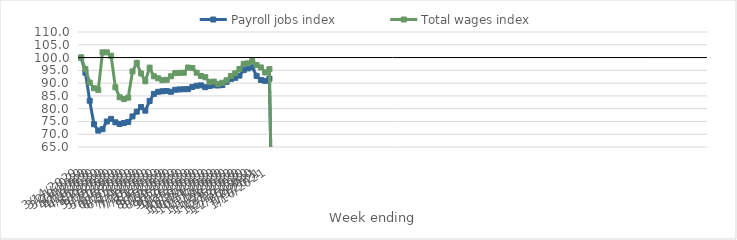
| Category | Payroll jobs index | Total wages index |
|---|---|---|
| 14/03/2020 | 100 | 100 |
| 21/03/2020 | 94.076 | 95.496 |
| 28/03/2020 | 83.088 | 90.226 |
| 04/04/2020 | 73.89 | 87.992 |
| 11/04/2020 | 71.422 | 87.344 |
| 18/04/2020 | 71.98 | 102.041 |
| 25/04/2020 | 74.982 | 102.035 |
| 02/05/2020 | 76.008 | 100.692 |
| 09/05/2020 | 74.663 | 88.355 |
| 16/05/2020 | 74.022 | 84.458 |
| 23/05/2020 | 74.402 | 83.751 |
| 30/05/2020 | 74.781 | 84.325 |
| 06/06/2020 | 76.956 | 94.561 |
| 13/06/2020 | 78.826 | 97.902 |
| 20/06/2020 | 80.622 | 93.762 |
| 27/06/2020 | 79.219 | 90.743 |
| 04/07/2020 | 83.003 | 96.029 |
| 11/07/2020 | 85.789 | 92.665 |
| 18/07/2020 | 86.604 | 91.878 |
| 25/07/2020 | 86.809 | 91.144 |
| 01/08/2020 | 86.924 | 91.296 |
| 08/08/2020 | 86.608 | 92.669 |
| 15/08/2020 | 87.394 | 93.91 |
| 22/08/2020 | 87.542 | 94.012 |
| 29/08/2020 | 87.599 | 94.052 |
| 05/09/2020 | 87.637 | 96.1 |
| 12/09/2020 | 88.51 | 95.885 |
| 19/09/2020 | 88.962 | 94.049 |
| 26/09/2020 | 89.125 | 92.783 |
| 03/10/2020 | 88.403 | 92.316 |
| 10/10/2020 | 88.868 | 90.465 |
| 17/10/2020 | 89.138 | 90.595 |
| 24/10/2020 | 89.079 | 89.713 |
| 31/10/2020 | 89.225 | 90.132 |
| 07/11/2020 | 90.511 | 91.112 |
| 14/11/2020 | 91.565 | 92.81 |
| 21/11/2020 | 92.068 | 93.819 |
| 28/11/2020 | 92.934 | 95.503 |
| 05/12/2020 | 95.085 | 97.557 |
| 12/12/2020 | 95.745 | 97.746 |
| 19/12/2020 | 96.199 | 98.69 |
| 26/12/2020 | 92.83 | 97.096 |
| 02/01/2021 | 91.221 | 96.136 |
| 09/01/2021 | 90.873 | 94.169 |
| 16/01/2021 | 91.732 | 95.461 |